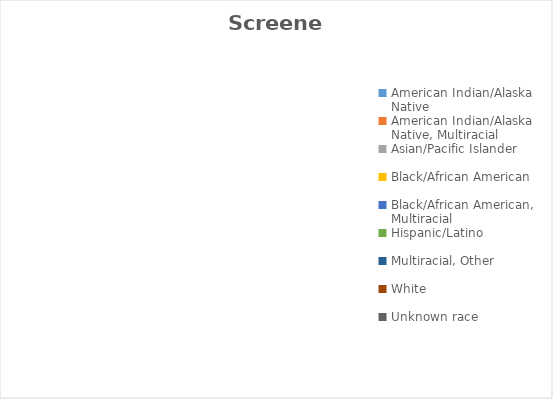
| Category | Screened |
|---|---|
| American Indian/Alaska Native  | 0 |
| American Indian/Alaska Native, Multiracial | 0 |
| Asian/Pacific Islander | 0 |
| Black/African American | 0 |
| Black/African American, Multiracial | 0 |
| Hispanic/Latino  | 0 |
| Multiracial, Other | 0 |
| White  | 0 |
| Unknown race | 0 |